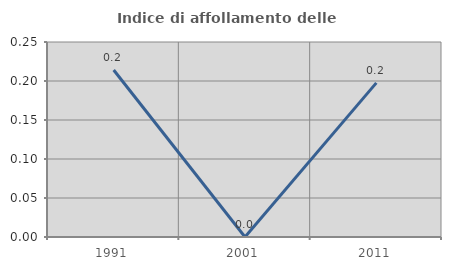
| Category | Indice di affollamento delle abitazioni  |
|---|---|
| 1991.0 | 0.214 |
| 2001.0 | 0 |
| 2011.0 | 0.198 |